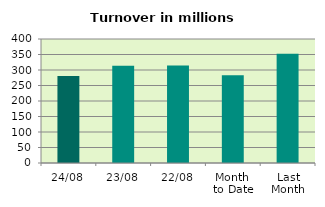
| Category | Series 0 |
|---|---|
| 24/08 | 280.282 |
| 23/08 | 314.079 |
| 22/08 | 314.452 |
| Month 
to Date | 282.668 |
| Last
Month | 352.063 |